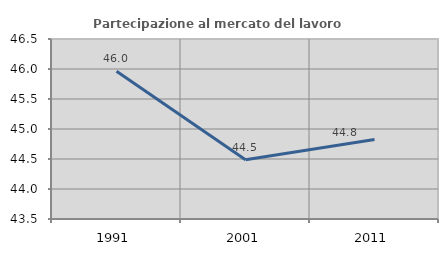
| Category | Partecipazione al mercato del lavoro  femminile |
|---|---|
| 1991.0 | 45.961 |
| 2001.0 | 44.486 |
| 2011.0 | 44.827 |